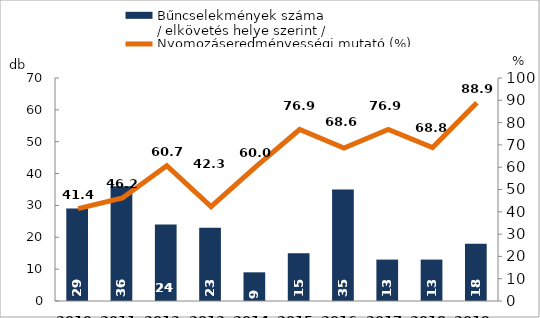
| Category | Bűncselekmények száma
/ elkövetés helye szerint / |
|---|---|
| 2010. év | 29 |
| 2011. év | 36 |
| 2012. év | 24 |
| 2013. év | 23 |
| 2014. év | 9 |
| 2015. év | 15 |
| 2016. év | 35 |
| 2017. év | 13 |
| 2018. év | 13 |
| 2019. év | 18 |